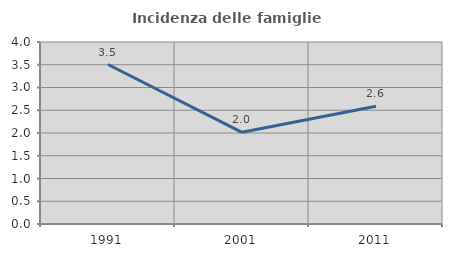
| Category | Incidenza delle famiglie numerose |
|---|---|
| 1991.0 | 3.505 |
| 2001.0 | 2.015 |
| 2011.0 | 2.588 |